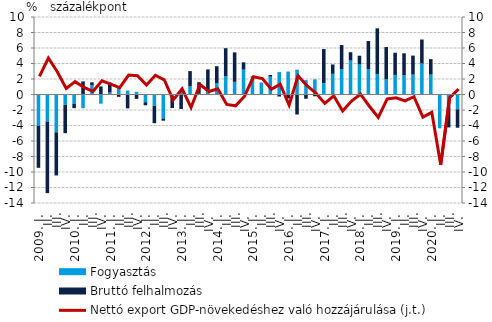
| Category | Fogyasztás | Bruttó felhalmozás |
|---|---|---|
| 2009. I. | -4.026 | -5.434 |
|          II. | -3.484 | -9.24 |
|          III. | -4.878 | -5.566 |
|          IV. | -1.328 | -3.66 |
| 2010. I. | -1.202 | -0.558 |
|          II. | -1.765 | 1.69 |
|          III. | 1.178 | 0.396 |
|          IV. | -1.182 | 1.04 |
| 2011. I. | 0.246 | 1.291 |
|          II. | 0.953 | -0.3 |
|          III. | 0.516 | -1.792 |
|          IV. | 0.353 | -0.564 |
| 2012. I. | -0.999 | -0.394 |
|          II. | -1.45 | -2.251 |
|          III. | -3.09 | -0.289 |
|          IV. | -0.227 | -1.513 |
| 2013. I. | 0.409 | -1.874 |
| II. | 1.081 | 1.94 |
|          III. | 0.1 | 1.487 |
| IV. | 0.451 | 2.786 |
| 2014. I. | 1.483 | 2.167 |
| II. | 2.351 | 3.624 |
|          III. | 1.636 | 3.804 |
| IV. | 3.21 | 0.942 |
| 2015. I. | 2.317 | 0.054 |
| II. | 1.457 | 0.063 |
|          III. | 2.302 | 0.214 |
| IV. | 2.894 | -0.261 |
| 2016. I. | 2.962 | -0.518 |
| II. | 3.206 | -2.583 |
|          III. | 1.854 | -0.547 |
| IV. | 1.958 | -0.229 |
| 2017. I. | 1.476 | 4.386 |
| II. | 2.665 | 1.212 |
|          III. | 3.282 | 3.1 |
| IV. | 4.384 | 1.078 |
| 2018. I. | 3.87 | 1.136 |
| II. | 3.294 | 3.613 |
|          III. | 2.622 | 5.915 |
| IV. | 1.964 | 4.16 |
| 2019. I. | 2.526 | 2.864 |
| II. | 2.49 | 2.826 |
|          III. | 2.57 | 2.449 |
| IV. | 4.004 | 3.09 |
| 2020. I. | 2.567 | 2.001 |
| II. | -4.366 | 0.061 |
|          III. | -1.413 | -2.833 |
| IV. | -1.913 | -2.37 |